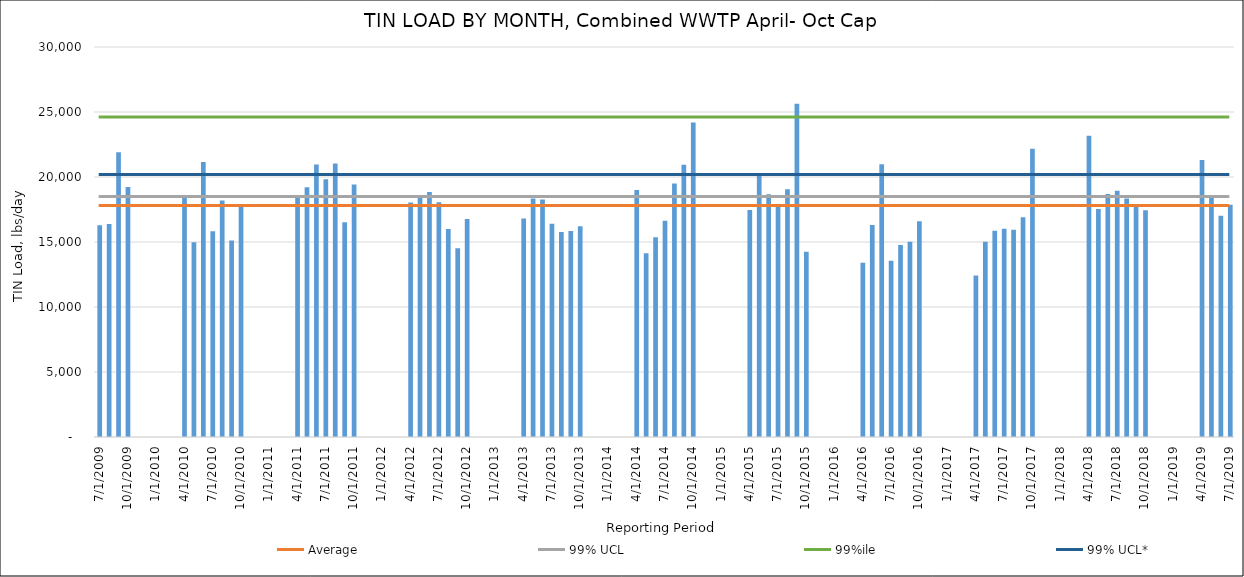
| Category | Series 0 |
|---|---|
| 7/31/09 | 16287.214 |
| 8/31/09 | 16393.016 |
| 9/30/09 | 21900.907 |
| 10/31/09 | 19228.082 |
| 4/30/10 | 18489.96 |
| 5/31/10 | 14984.572 |
| 6/30/10 | 21158.193 |
| 7/31/10 | 15831.48 |
| 8/31/10 | 18200.295 |
| 9/30/10 | 15107.676 |
| 10/31/10 | 17910.344 |
| 4/30/11 | 18385.659 |
| 5/31/11 | 19212.077 |
| 6/30/11 | 20956.694 |
| 7/31/11 | 19825.238 |
| 8/31/11 | 21045.485 |
| 9/30/11 | 16520.206 |
| 10/31/11 | 19417.317 |
| 4/30/12 | 18034.551 |
| 5/31/12 | 18473.705 |
| 6/30/12 | 18838.699 |
| 7/31/12 | 18062.797 |
| 8/31/12 | 15996.389 |
| 9/30/12 | 14519.646 |
| 10/31/12 | 16770.16 |
| 4/30/13 | 16808.381 |
| 5/31/13 | 18339.11 |
| 6/30/13 | 18274.977 |
| 7/31/13 | 16411.139 |
| 8/31/13 | 15759.663 |
| 9/30/13 | 15852.869 |
| 10/31/13 | 16219.045 |
| 4/30/14 | 19009.039 |
| 5/31/14 | 14140.103 |
| 6/30/14 | 15365.197 |
| 7/31/14 | 16639.196 |
| 8/31/14 | 19497.776 |
| 9/30/14 | 20949.086 |
| 10/31/14 | 24185.877 |
| 4/30/15 | 17456.488 |
| 5/31/15 | 20171.479 |
| 6/30/15 | 18667.82 |
| 7/31/15 | 17868.191 |
| 8/31/15 | 19063.921 |
| 9/30/15 | 25640.729 |
| 10/31/15 | 14246.209 |
| 4/30/16 | 13404.15 |
| 5/31/16 | 16314.162 |
| 6/30/16 | 20985.515 |
| 7/31/16 | 13552.785 |
| 8/31/16 | 14773.754 |
| 9/30/16 | 15011.447 |
| 10/31/16 | 16586.995 |
| 4/30/17 | 12430.183 |
| 5/31/17 | 15021.595 |
| 6/30/17 | 15873.803 |
| 7/31/17 | 16024.986 |
| 8/31/17 | 15943.362 |
| 9/30/17 | 16897.085 |
| 10/31/17 | 22164.099 |
| 4/30/18 | 23176.931 |
| 5/31/18 | 17534.073 |
| 6/30/18 | 18696.221 |
| 7/31/18 | 18949.749 |
| 8/31/18 | 18354.77 |
| 9/30/18 | 17694.561 |
| 10/31/18 | 17442.711 |
| 4/30/19 | 21306.7 |
| 5/31/19 | 18553.381 |
| 6/30/19 | 17026.238 |
| 7/31/19 | 17871.058 |